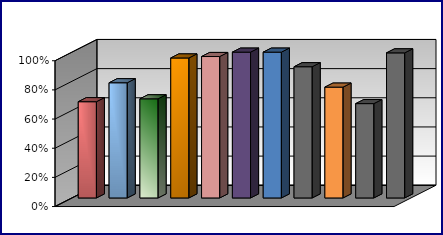
| Category | Series 0 | Series 1 | Series 2 | Series 3 |
|---|---|---|---|---|
| 0 | 0.66 |  |  |  |
| 1 | 0.79 |  |  |  |
| 2 | 0.68 |  |  |  |
| 3 | 0.96 |  |  |  |
| 4 | 0.97 |  |  |  |
| 5 | 1 |  |  |  |
| 6 | 1 |  |  |  |
| 7 | 0.9 |  |  |  |
| 8 | 0.76 |  |  |  |
| 9 | 0.647 |  |  |  |
| 10 | 0.995 |  |  |  |